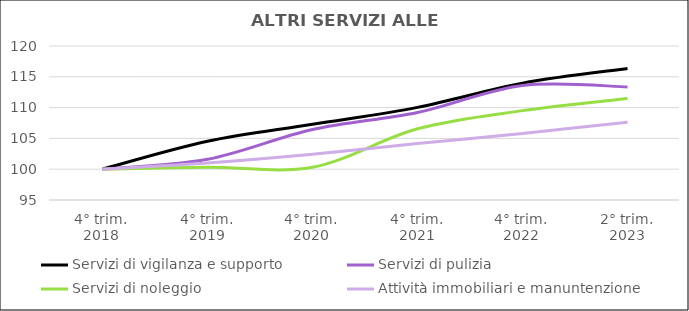
| Category | Servizi di vigilanza e supporto | Servizi di pulizia | Servizi di noleggio  | Attività immobiliari e manuntenzione  |
|---|---|---|---|---|
| 4° trim.
2018 | 100 | 100 | 100 | 100 |
| 4° trim.
2019 | 104.528 | 101.613 | 100.328 | 101.016 |
| 4° trim.
2020 | 107.283 | 106.452 | 100.328 | 102.436 |
| 4° trim.
2021 | 110.039 | 109.217 | 106.557 | 104.169 |
| 4° trim.
2022 | 113.976 | 113.594 | 109.508 | 105.813 |
| 2° trim.
2023 | 116.339 | 113.364 | 111.475 | 107.606 |